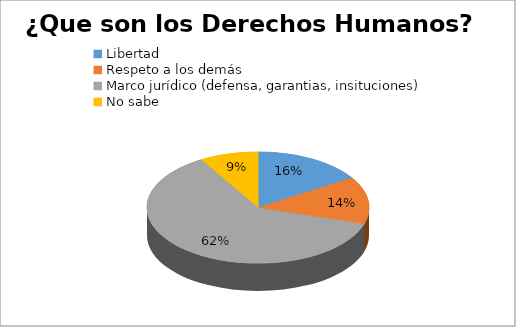
| Category | Series 0 |
|---|---|
| Libertad | 15 |
| Respeto a los demás | 13 |
| Marco jurídico (defensa, garantias, insituciones) | 58 |
| No sabe | 8 |